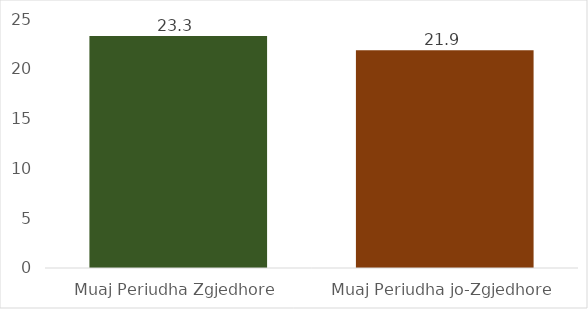
| Category | Mesatarisht Pagesa për Muaj |
|---|---|
| Muaj Periudha Zgjedhore | 23.3 |
| Muaj Periudha jo-Zgjedhore | 21.86 |